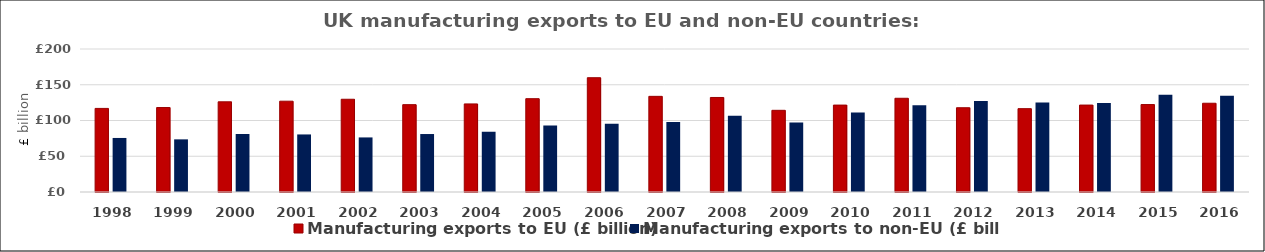
| Category | Manufacturing exports to EU (£ billion) | Manufacturing exports to non-EU (£ billion) |
|---|---|---|
| 1998 | 116.901 | 75.581 |
| 1999 | 118.137 | 73.629 |
| 2000 | 126.12 | 81.087 |
| 2001 | 126.994 | 80.502 |
| 2002 | 129.714 | 76.329 |
| 2003 | 122.166 | 81.077 |
| 2004 | 123.194 | 84.271 |
| 2005 | 130.522 | 93.002 |
| 2006 | 159.848 | 95.511 |
| 2007 | 133.764 | 97.984 |
| 2008 | 132.211 | 106.753 |
| 2009 | 114.234 | 97.23 |
| 2010 | 121.567 | 111.138 |
| 2011 | 131.096 | 121.452 |
| 2012 | 117.868 | 127.235 |
| 2013 | 116.579 | 125.054 |
| 2014 | 121.573 | 124.511 |
| 2015 | 122.308 | 136.018 |
| 2016 | 124.139 | 134.563 |